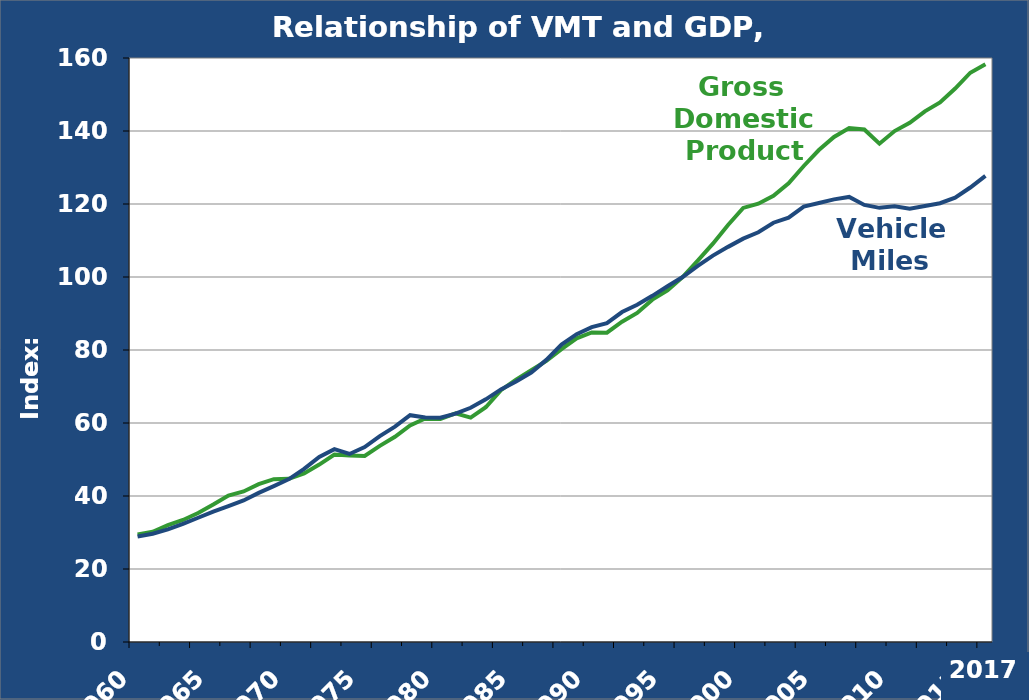
| Category | Gross Domestic Product
 Indexed to 1996 | Vehicle Miles of Travel
Indexed to 1996 |
|---|---|---|
| 1960.0 | 29.436 | 28.914 |
| 1961.0 | 30.187 | 29.665 |
| 1962.0 | 32.034 | 30.844 |
| 1963.0 | 33.429 | 32.393 |
| 1964.0 | 35.357 | 34.045 |
| 1965.0 | 37.655 | 35.715 |
| 1966.0 | 40.137 | 37.247 |
| 1967.0 | 41.239 | 38.78 |
| 1968.0 | 43.263 | 40.866 |
| 1969.0 | 44.622 | 42.713 |
| 1970.0 | 44.712 | 44.642 |
| 1971.0 | 46.185 | 47.421 |
| 1972.0 | 48.616 | 50.678 |
| 1973.0 | 51.36 | 52.823 |
| 1974.0 | 51.094 | 51.513 |
| 1975.0 | 50.993 | 53.409 |
| 1976.0 | 53.739 | 56.415 |
| 1977.0 | 56.216 | 59.015 |
| 1978.0 | 59.343 | 62.14 |
| 1979.0 | 61.227 | 61.514 |
| 1980.0 | 61.078 | 61.44 |
| 1981.0 | 62.662 | 62.566 |
| 1982.0 | 61.465 | 64.164 |
| 1983.0 | 64.312 | 66.488 |
| 1984.0 | 68.98 | 69.203 |
| 1985.0 | 71.904 | 71.397 |
| 1986.0 | 74.43 | 73.813 |
| 1987.0 | 77.006 | 77.286 |
| 1988.0 | 80.243 | 81.5 |
| 1989.0 | 83.197 | 84.337 |
| 1990.0 | 84.793 | 86.263 |
| 1991.0 | 84.731 | 87.377 |
| 1992.0 | 87.744 | 90.398 |
| 1993.0 | 90.152 | 92.378 |
| 1994.0 | 93.792 | 94.84 |
| 1995.0 | 96.343 | 97.46 |
| 1996.0 | 100 | 100 |
| 1997.0 | 104.487 | 103.051 |
| 1998.0 | 109.136 | 105.86 |
| 1999.0 | 114.25 | 108.255 |
| 2000.0 | 118.925 | 110.503 |
| 2001.0 | 120.085 | 112.25 |
| 2002.0 | 122.231 | 114.871 |
| 2003.0 | 125.661 | 116.276 |
| 2004.0 | 130.419 | 119.267 |
| 2005.0 | 134.781 | 120.258 |
| 2006.0 | 138.375 | 121.261 |
| 2007.0 | 140.836 | 121.935 |
| 2008.0 | 140.426 | 119.739 |
| 2009.0 | 136.528 | 118.944 |
| 2010.0 | 139.985 | 119.366 |
| 2011.0 | 142.227 | 118.688 |
| 2012.0 | 145.39 | 119.454 |
| 2013.0 | 147.829 | 120.212 |
| 2014.0 | 151.627 | 121.715 |
| 2015.0 | 155.965 | 124.52 |
| 2016.0 | 158.282 | 127.699 |